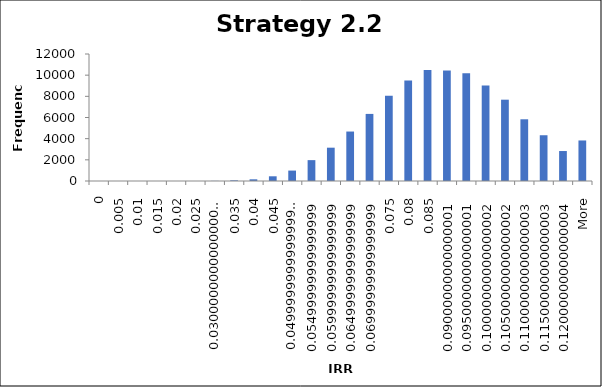
| Category | Frequency |
|---|---|
| 0 | 1 |
| 0.005 | 0 |
| 0.01 | 0 |
| 0.015 | 0 |
| 0.02 | 0 |
| 0.025 | 2 |
| 0.03 | 12 |
| 0.035 | 61 |
| 0.04 | 159 |
| 0.045 | 445 |
| 0.05 | 985 |
| 0.055 | 1972 |
| 0.06 | 3148 |
| 0.065 | 4674 |
| 0.07 | 6339 |
| 0.075 | 8059 |
| 0.08 | 9493 |
| 0.085 | 10497 |
| 0.09 | 10440 |
| 0.095 | 10183 |
| 0.1 | 9032 |
| 0.105 | 7683 |
| 0.11 | 5831 |
| 0.115 | 4324 |
| 0.12 | 2832 |
| More | 3830 |